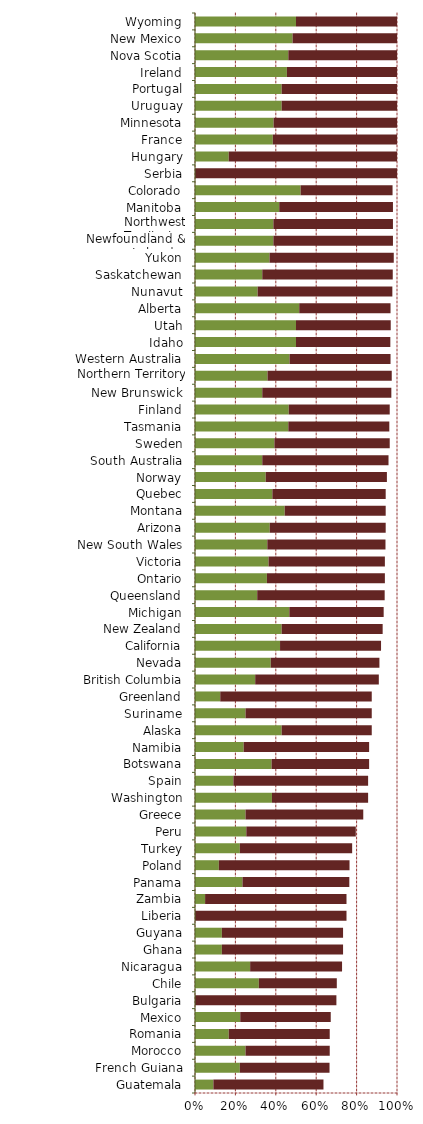
| Category |   Encourages Investment |   Not a Deterrent to Investment |
|---|---|---|
| Guatemala | 0.091 | 0.545 |
| French Guiana | 0.222 | 0.444 |
| Morocco | 0.25 | 0.417 |
| Romania | 0.167 | 0.5 |
| Mexico | 0.224 | 0.448 |
| Bulgaria | 0 | 0.7 |
| Chile | 0.316 | 0.386 |
| Nicaragua | 0.273 | 0.455 |
| Ghana | 0.133 | 0.6 |
| Guyana | 0.133 | 0.6 |
| Liberia | 0 | 0.75 |
| Zambia | 0.05 | 0.7 |
| Panama | 0.235 | 0.529 |
| Poland | 0.118 | 0.647 |
| Turkey | 0.222 | 0.556 |
| Peru | 0.254 | 0.542 |
| Greece | 0.25 | 0.583 |
| Washington | 0.381 | 0.476 |
| Spain | 0.19 | 0.667 |
| Botswana | 0.379 | 0.483 |
| Namibia | 0.241 | 0.621 |
| Alaska | 0.429 | 0.446 |
| Suriname | 0.25 | 0.625 |
| Greenland | 0.125 | 0.75 |
| British Columbia | 0.298 | 0.612 |
| Nevada | 0.375 | 0.538 |
| California | 0.421 | 0.5 |
| New Zealand | 0.429 | 0.5 |
| Michigan | 0.467 | 0.467 |
| Queensland | 0.308 | 0.631 |
| Ontario | 0.356 | 0.584 |
| Victoria | 0.364 | 0.576 |
| New South Wales | 0.358 | 0.585 |
| Arizona | 0.37 | 0.574 |
| Montana | 0.444 | 0.5 |
| Quebec | 0.383 | 0.561 |
| Norway | 0.35 | 0.6 |
| South Australia | 0.333 | 0.625 |
| Sweden | 0.393 | 0.571 |
| Tasmania | 0.462 | 0.5 |
| Finland | 0.464 | 0.5 |
| New Brunswick | 0.333 | 0.639 |
| Northern Territory | 0.359 | 0.615 |
| Western Australia | 0.468 | 0.5 |
| Idaho | 0.5 | 0.467 |
| Utah | 0.5 | 0.469 |
| Alberta | 0.516 | 0.452 |
| Nunavut | 0.31 | 0.667 |
| Saskatchewan | 0.333 | 0.646 |
| Yukon | 0.369 | 0.615 |
| Newfoundland & Labrador | 0.388 | 0.592 |
| Northwest Territories | 0.388 | 0.592 |
| Manitoba | 0.417 | 0.563 |
| Colorado | 0.523 | 0.455 |
| Serbia | 0 | 1 |
| Hungary | 0.167 | 0.833 |
| France | 0.385 | 0.615 |
| Minnesota | 0.389 | 0.611 |
| Uruguay | 0.429 | 0.571 |
| Portugal | 0.429 | 0.571 |
| Ireland | 0.455 | 0.545 |
| Nova Scotia | 0.462 | 0.538 |
| New Mexico | 0.483 | 0.517 |
| Wyoming | 0.5 | 0.5 |